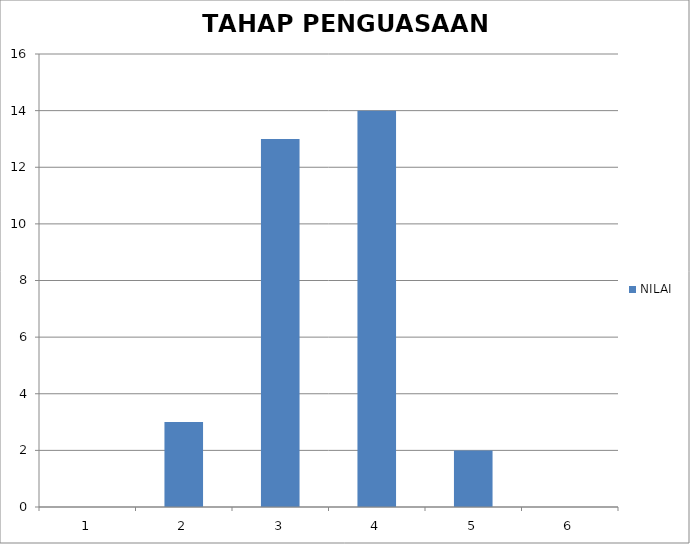
| Category | NILAI |
|---|---|
| 1.0 | 0 |
| 2.0 | 3 |
| 3.0 | 13 |
| 4.0 | 14 |
| 5.0 | 2 |
| 6.0 | 0 |